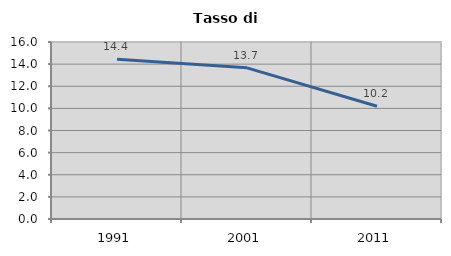
| Category | Tasso di disoccupazione   |
|---|---|
| 1991.0 | 14.433 |
| 2001.0 | 13.666 |
| 2011.0 | 10.187 |